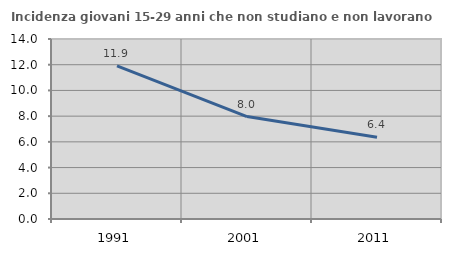
| Category | Incidenza giovani 15-29 anni che non studiano e non lavorano  |
|---|---|
| 1991.0 | 11.905 |
| 2001.0 | 7.965 |
| 2011.0 | 6.364 |